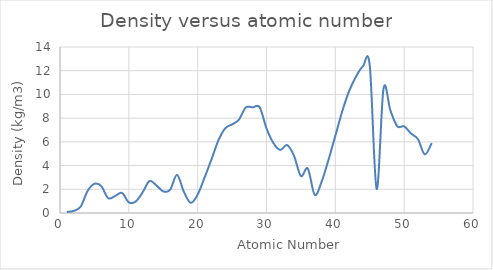
| Category | Series 0 |
|---|---|
| 1.0 | 0.09 |
| 2.0 | 0.178 |
| 3.0 | 0.535 |
| 4.0 | 1.848 |
| 5.0 | 2.46 |
| 6.0 | 2.26 |
| 7.0 | 1.251 |
| 8.0 | 1.429 |
| 9.0 | 1.696 |
| 10.0 | 0.9 |
| 11.0 | 0.968 |
| 12.0 | 1.738 |
| 13.0 | 2.7 |
| 14.0 | 2.33 |
| 15.0 | 1.823 |
| 16.0 | 1.96 |
| 17.0 | 3.214 |
| 18.0 | 1.784 |
| 19.0 | 0.856 |
| 20.0 | 1.55 |
| 21.0 | 2.985 |
| 22.0 | 4.507 |
| 23.0 | 6.11 |
| 24.0 | 7.14 |
| 25.0 | 7.47 |
| 26.0 | 7.874 |
| 27.0 | 8.9 |
| 28.0 | 8.908 |
| 29.0 | 8.92 |
| 30.0 | 7.14 |
| 31.0 | 5.904 |
| 32.0 | 5.323 |
| 33.0 | 5.727 |
| 34.0 | 4.819 |
| 35.0 | 3.12 |
| 36.0 | 3.75 |
| 37.0 | 1.532 |
| 38.0 | 2.63 |
| 39.0 | 4.472 |
| 40.0 | 6.511 |
| 41.0 | 8.57 |
| 42.0 | 10.28 |
| 43.0 | 11.5 |
| 44.0 | 12.37 |
| 45.0 | 12.45 |
| 46.0 | 2.023 |
| 47.0 | 10.49 |
| 48.0 | 8.65 |
| 49.0 | 7.31 |
| 50.0 | 7.31 |
| 51.0 | 6.697 |
| 52.0 | 6.23 |
| 53.0 | 4.94 |
| 54.0 | 5.9 |